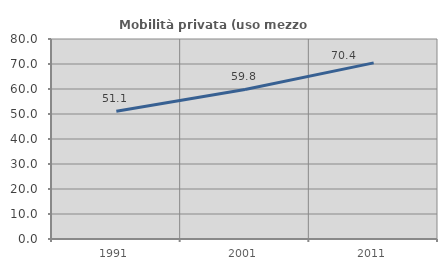
| Category | Mobilità privata (uso mezzo privato) |
|---|---|
| 1991.0 | 51.126 |
| 2001.0 | 59.814 |
| 2011.0 | 70.444 |